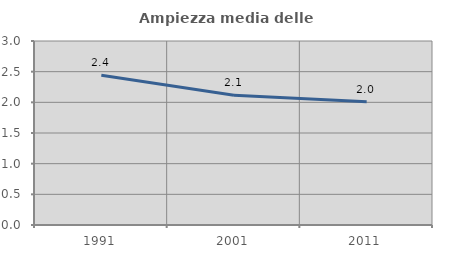
| Category | Ampiezza media delle famiglie |
|---|---|
| 1991.0 | 2.442 |
| 2001.0 | 2.116 |
| 2011.0 | 2.008 |